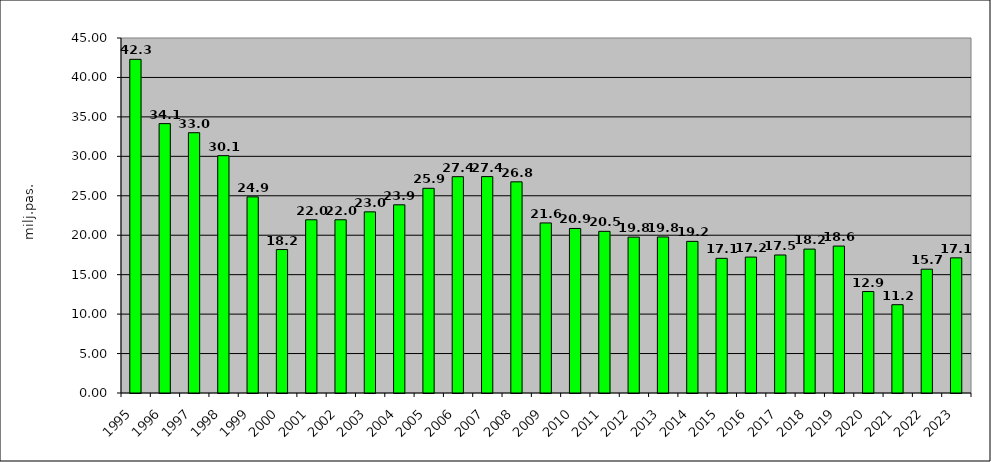
| Category | Series 0 |
|---|---|
| 1995.0 | 42.296 |
| 1996.0 | 34.147 |
| 1997.0 | 32.995 |
| 1998.0 | 30.084 |
| 1999.0 | 24.861 |
| 2000.0 | 18.184 |
| 2001.0 | 21.959 |
| 2002.0 | 21.959 |
| 2003.0 | 22.96 |
| 2004.0 | 23.855 |
| 2005.0 | 25.948 |
| 2006.0 | 27.421 |
| 2007.0 | 27.43 |
| 2008.0 | 26.767 |
| 2009.0 | 21.556 |
| 2010.0 | 20.857 |
| 2011.0 | 20.492 |
| 2012.0 | 19.757 |
| 2013.0 | 19.78 |
| 2014.0 | 19.222 |
| 2015.0 | 17.07 |
| 2016.0 | 17.228 |
| 2017.0 | 17.493 |
| 2018.0 | 18.241 |
| 2019.0 | 18.624 |
| 2020.0 | 12.862 |
| 2021.0 | 11.193 |
| 2022.0 | 15.695 |
| 2023.0 | 17.132 |